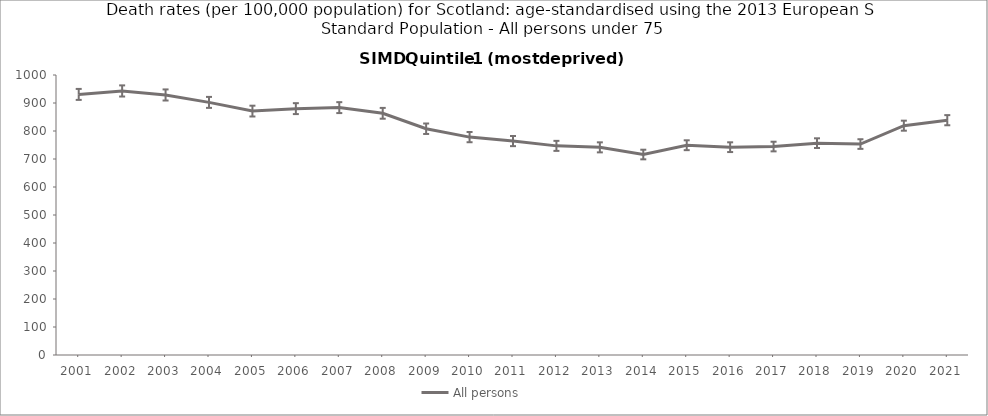
| Category | All persons |
|---|---|
| 2001.0 | 930.7 |
| 2002.0 | 943 |
| 2003.0 | 928.7 |
| 2004.0 | 902.2 |
| 2005.0 | 871.1 |
| 2006.0 | 879.9 |
| 2007.0 | 883.5 |
| 2008.0 | 863.2 |
| 2009.0 | 808.1 |
| 2010.0 | 778.2 |
| 2011.0 | 764 |
| 2012.0 | 746.9 |
| 2013.0 | 741.6 |
| 2014.0 | 716 |
| 2015.0 | 749.2 |
| 2016.0 | 742.2 |
| 2017.0 | 744.5 |
| 2018.0 | 756.6 |
| 2019.0 | 753.4 |
| 2020.0 | 819 |
| 2021.0 | 838.6 |